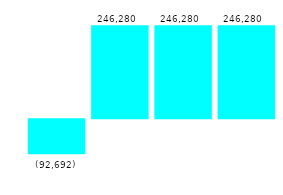
| Category | Series 0 |
|---|---|
| 0 | -92692.308 |
| 1 | 246280 |
| 2 | 246280 |
| 3 | 246280 |